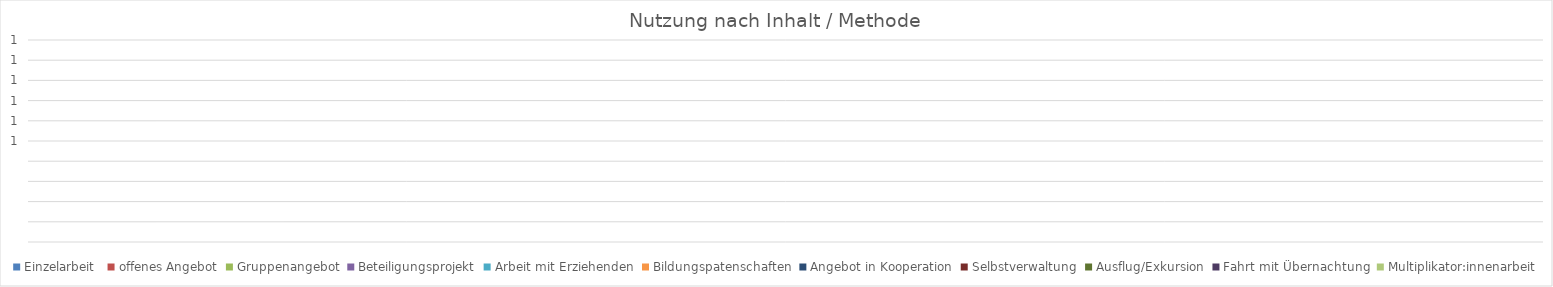
| Category | Einzelarbeit  | offenes Angebot | Gruppenangebot | Beteiligungsprojekt | Arbeit mit Erziehenden | Bildungspatenschaften | Angebot in Kooperation | Selbstverwaltung | Ausflug/Exkursion | Fahrt mit Übernachtung | Multiplikator:innenarbeit |
|---|---|---|---|---|---|---|---|---|---|---|---|
| 0 | 0 | 0 | 0 | 0 | 0 | 0 | 0 | 0 | 0 | 0 | 0 |